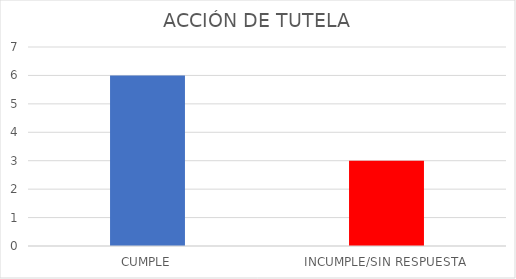
| Category | TOTAL |
|---|---|
| CUMPLE | 6 |
| INCUMPLE/SIN RESPUESTA | 3 |